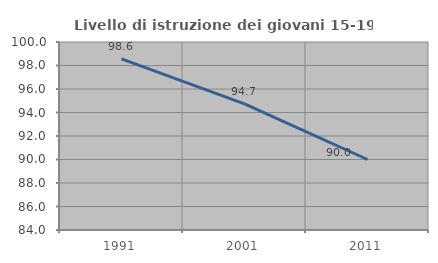
| Category | Livello di istruzione dei giovani 15-19 anni |
|---|---|
| 1991.0 | 98.571 |
| 2001.0 | 94.737 |
| 2011.0 | 90 |